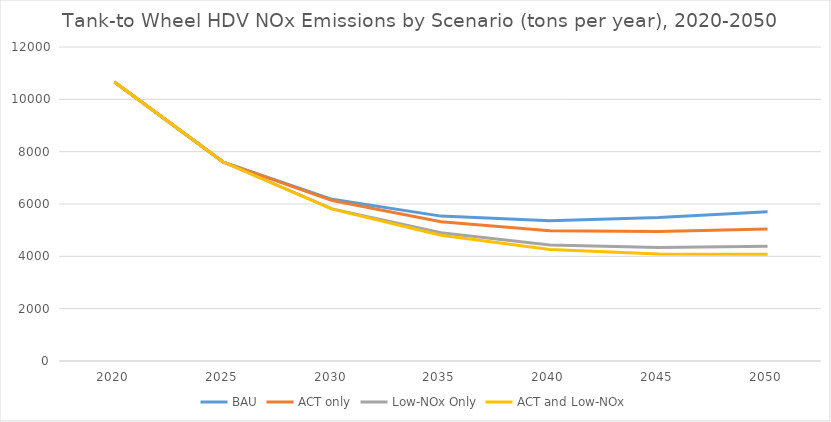
| Category | BAU | ACT only | Low-NOx Only | ACT and Low-NOx |
|---|---|---|---|---|
| 2020.0 | 10662.42 | 10662.42 | 10662.42 | 10662.42 |
| 2025.0 | 7602.829 | 7602.829 | 7602.829 | 7602.829 |
| 2030.0 | 6179.696 | 6132.685 | 5813.086 | 5804.476 |
| 2035.0 | 5536.99 | 5321.815 | 4899.748 | 4809.138 |
| 2040.0 | 5360.744 | 4981.319 | 4430.766 | 4264.982 |
| 2045.0 | 5484.777 | 4946.965 | 4337.466 | 4090.624 |
| 2050.0 | 5706.792 | 5040.333 | 4387.818 | 4075.962 |